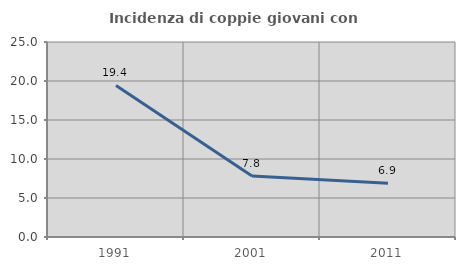
| Category | Incidenza di coppie giovani con figli |
|---|---|
| 1991.0 | 19.427 |
| 2001.0 | 7.818 |
| 2011.0 | 6.897 |